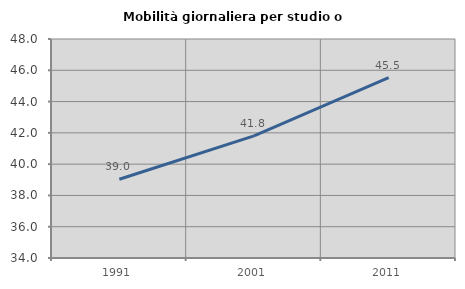
| Category | Mobilità giornaliera per studio o lavoro |
|---|---|
| 1991.0 | 39.037 |
| 2001.0 | 41.808 |
| 2011.0 | 45.523 |